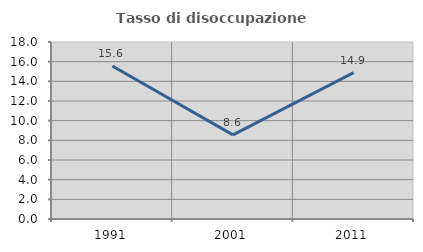
| Category | Tasso di disoccupazione giovanile  |
|---|---|
| 1991.0 | 15.556 |
| 2001.0 | 8.559 |
| 2011.0 | 14.884 |